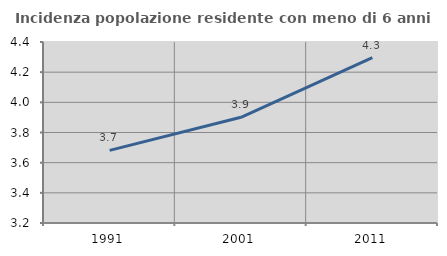
| Category | Incidenza popolazione residente con meno di 6 anni |
|---|---|
| 1991.0 | 3.682 |
| 2001.0 | 3.901 |
| 2011.0 | 4.296 |